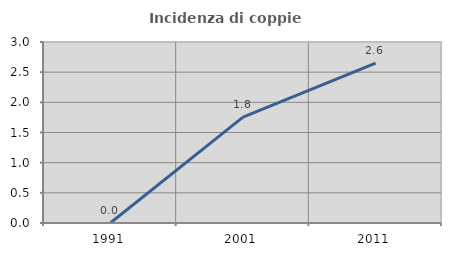
| Category | Incidenza di coppie miste |
|---|---|
| 1991.0 | 0 |
| 2001.0 | 1.754 |
| 2011.0 | 2.649 |